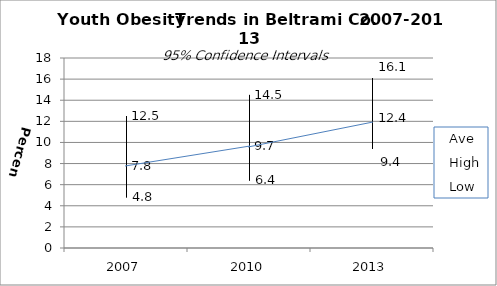
| Category | Ave | High | Low |
|---|---|---|---|
| 2007.0 | 7.8 | 12.5 | 4.8 |
| 2010.0 | 9.7 | 14.5 | 6.4 |
| 2013.0 | 12.4 | 16.1 | 9.4 |